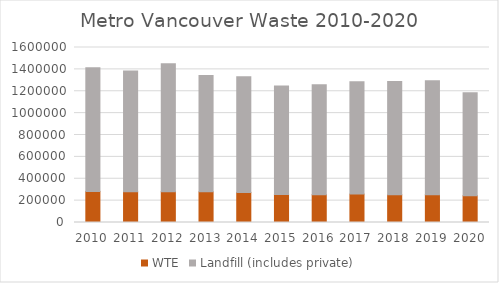
| Category | WTE | Landfill (includes private) |
|---|---|---|
| 2010.0 | 284468 | 1129532 |
| 2011.0 | 281139 | 1102937 |
| 2012.0 | 281260 | 1169213 |
| 2013.0 | 280138 | 1064667 |
| 2014.0 | 275260 | 1057056 |
| 2015.0 | 256402 | 992703 |
| 2016.0 | 254256 | 1004266 |
| 2017.0 | 259748 | 1026426 |
| 2018.0 | 253126 | 1035049 |
| 2019.0 | 253148 | 1042977 |
| 2020.0 | 244362 | 943025 |